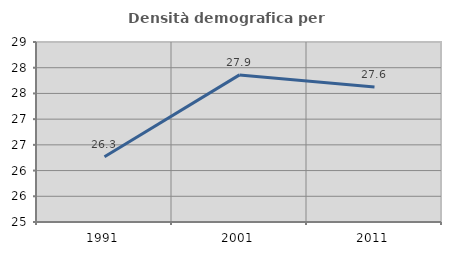
| Category | Densità demografica |
|---|---|
| 1991.0 | 26.268 |
| 2001.0 | 27.86 |
| 2011.0 | 27.626 |